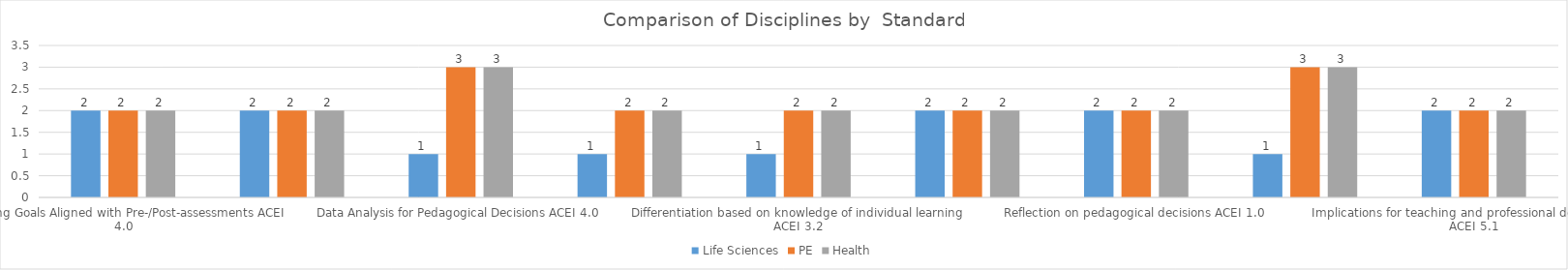
| Category | Life Sciences | PE | Health |
|---|---|---|---|
| Learning Goals Aligned with Pre-/Post-assessments ACEI 4.0 | 2 | 2 | 2 |
| Data Points | 2 | 2 | 2 |
| Data Analysis for Pedagogical Decisions ACEI 4.0 | 1 | 3 | 3 |
| Integrated Instruction ACEI 3.1 | 1 | 2 | 2 |
| Differentiation based on knowledge of individual learning ACEI 3.2 | 1 | 2 | 2 |
| Technology integration | 2 | 2 | 2 |
| Reflection on pedagogical decisions ACEI 1.0 | 2 | 2 | 2 |
| Evidence of impact on student learning ACEI 5.1 | 1 | 3 | 3 |
| Implications for teaching and professional development ACEI 5.1 | 2 | 2 | 2 |